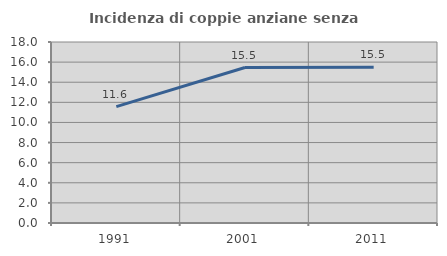
| Category | Incidenza di coppie anziane senza figli  |
|---|---|
| 1991.0 | 11.575 |
| 2001.0 | 15.462 |
| 2011.0 | 15.483 |